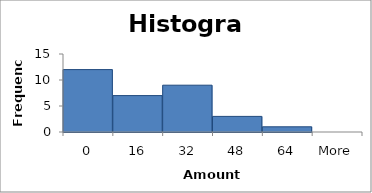
| Category | Frequency |
|---|---|
| 0 | 12 |
| 16 | 7 |
| 32 | 9 |
| 48 | 3 |
| 64 | 1 |
| More | 0 |